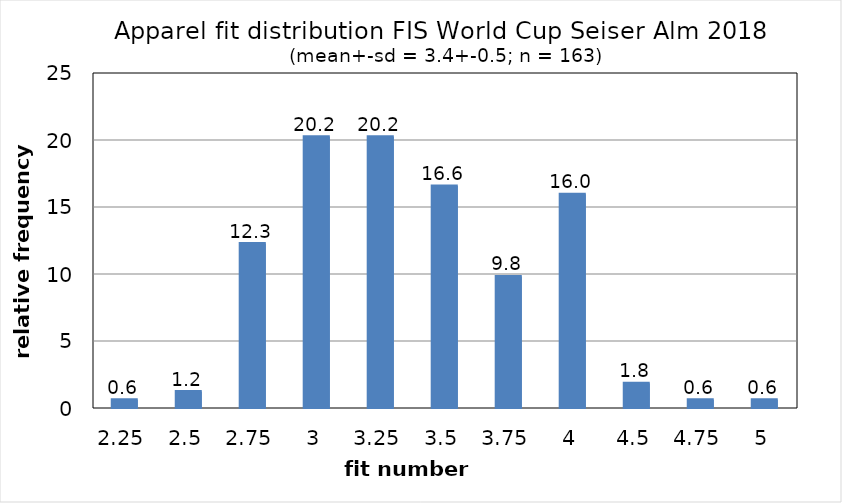
| Category | Series 0 |
|---|---|
| 2.25 | 0.613 |
| 2.5 | 1.227 |
| 2.75 | 12.27 |
| 3.0 | 20.245 |
| 3.25 | 20.245 |
| 3.5 | 16.564 |
| 3.75 | 9.816 |
| 4.0 | 15.951 |
| 4.5 | 1.84 |
| 4.75 | 0.613 |
| 5.0 | 0.613 |